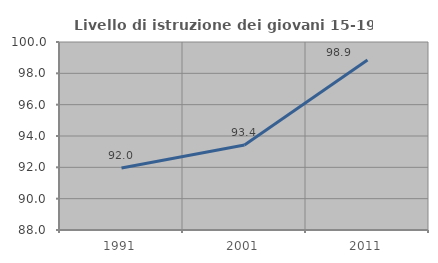
| Category | Livello di istruzione dei giovani 15-19 anni |
|---|---|
| 1991.0 | 91.961 |
| 2001.0 | 93.421 |
| 2011.0 | 98.857 |